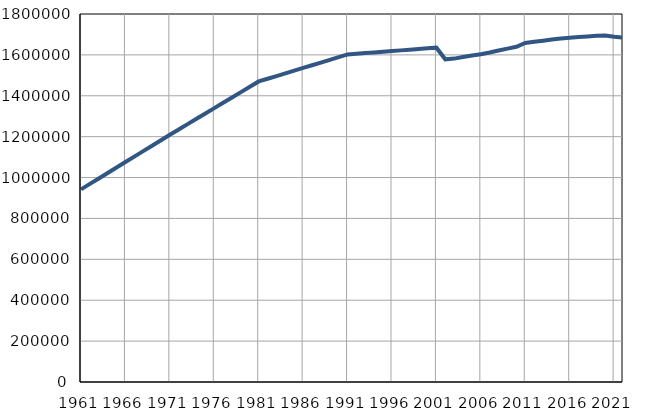
| Category | Број
становника |
|---|---|
| 1961.0 | 942190 |
| 1962.0 | 968907 |
| 1963.0 | 995625 |
| 1964.0 | 1022342 |
| 1965.0 | 1049059 |
| 1966.0 | 1075775 |
| 1967.0 | 1102492 |
| 1968.0 | 1129209 |
| 1969.0 | 1155926 |
| 1970.0 | 1182643 |
| 1971.0 | 1209360 |
| 1972.0 | 1235431 |
| 1973.0 | 1261503 |
| 1974.0 | 1287574 |
| 1975.0 | 1313645 |
| 1976.0 | 1339719 |
| 1977.0 | 1365788 |
| 1978.0 | 1391859 |
| 1979.0 | 1417930 |
| 1980.0 | 1444002 |
| 1981.0 | 1470073 |
| 1982.0 | 1483288 |
| 1983.0 | 1496504 |
| 1984.0 | 1509719 |
| 1985.0 | 1522934 |
| 1986.0 | 1536150 |
| 1987.0 | 1549365 |
| 1988.0 | 1562580 |
| 1989.0 | 1575795 |
| 1990.0 | 1589011 |
| 1991.0 | 1602226 |
| 1992.0 | 1605537 |
| 1993.0 | 1608847 |
| 1994.0 | 1612158 |
| 1995.0 | 1615469 |
| 1996.0 | 1618779 |
| 1997.0 | 1622091 |
| 1998.0 | 1625400 |
| 1999.0 | 1628711 |
| 2000.0 | 1632022 |
| 2001.0 | 1635333 |
| 2002.0 | 1578364 |
| 2003.0 | 1581844 |
| 2004.0 | 1589260 |
| 2005.0 | 1596919 |
| 2006.0 | 1602861 |
| 2007.0 | 1611333 |
| 2008.0 | 1621396 |
| 2009.0 | 1630582 |
| 2010.0 | 1639505 |
| 2011.0 | 1658151 |
| 2012.0 | 1664218 |
| 2013.0 | 1669552 |
| 2014.0 | 1675043 |
| 2015.0 | 1679895 |
| 2016.0 | 1683962 |
| 2017.0 | 1687132 |
| 2018.0 | 1690193 |
| 2019.0 | 1694056 |
| 2020.0 | 1694480 |
| 2021.0 | 1688667 |
| 2022.0 | 1684259 |